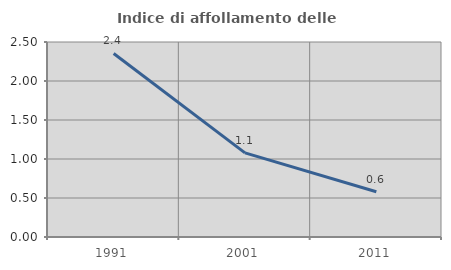
| Category | Indice di affollamento delle abitazioni  |
|---|---|
| 1991.0 | 2.353 |
| 2001.0 | 1.078 |
| 2011.0 | 0.58 |